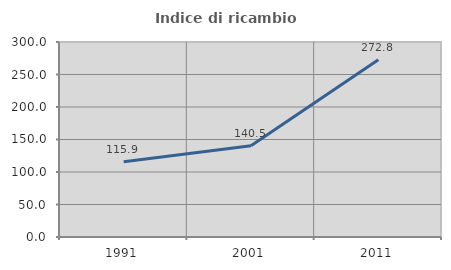
| Category | Indice di ricambio occupazionale  |
|---|---|
| 1991.0 | 115.894 |
| 2001.0 | 140.491 |
| 2011.0 | 272.816 |